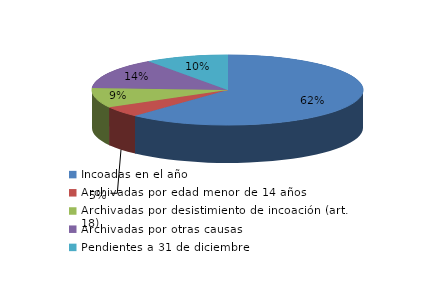
| Category | Series 0 |
|---|---|
| Incoadas en el año | 1446 |
| Archivadas por edad menor de 14 años | 115 |
| Archivadas por desistimiento de incoación (art. 18) | 211 |
| Archivadas por otras causas | 333 |
| Pendientes a 31 de diciembre | 230 |